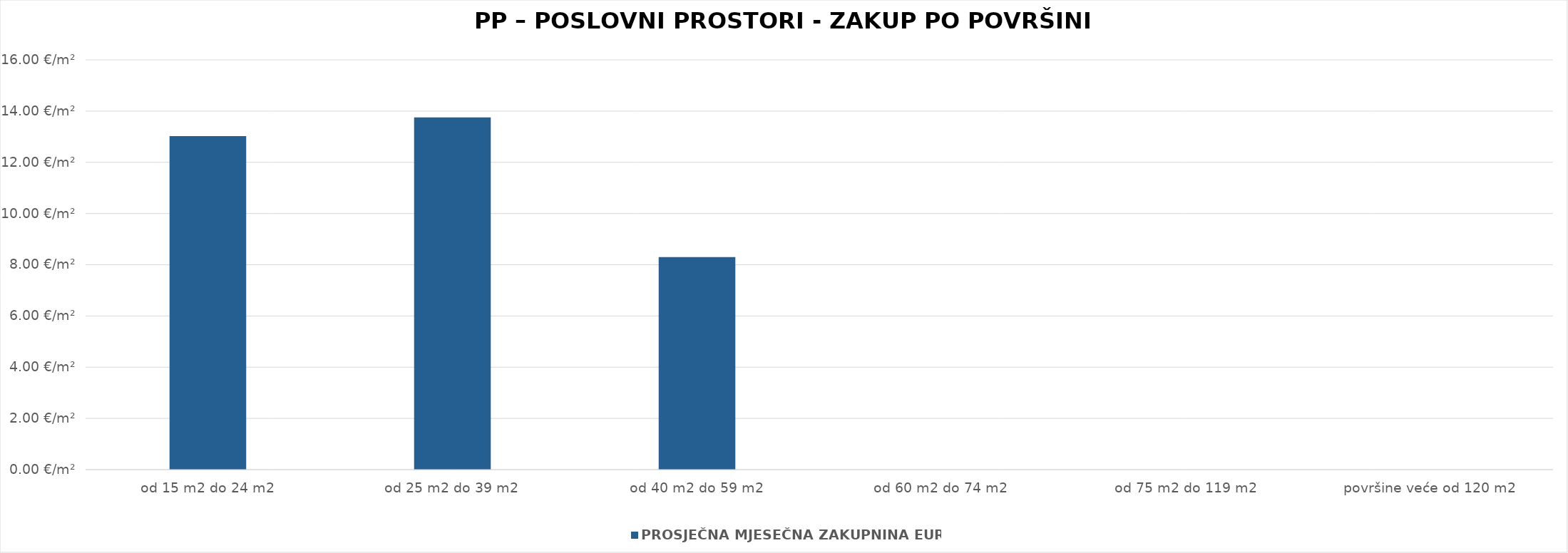
| Category | PROSJEČNA MJESEČNA ZAKUPNINA EUR/m2 |
|---|---|
| od 15 m2 do 24 m2 | 1900-01-13 00:32:27 |
| od 25 m2 do 39 m2 | 1900-01-13 18:02:11 |
| od 40 m2 do 59 m2 | 1900-01-08 07:09:04 |
| od 60 m2 do 74 m2 | 0 |
| od 75 m2 do 119 m2 | 0 |
| površine veće od 120 m2 | 0 |